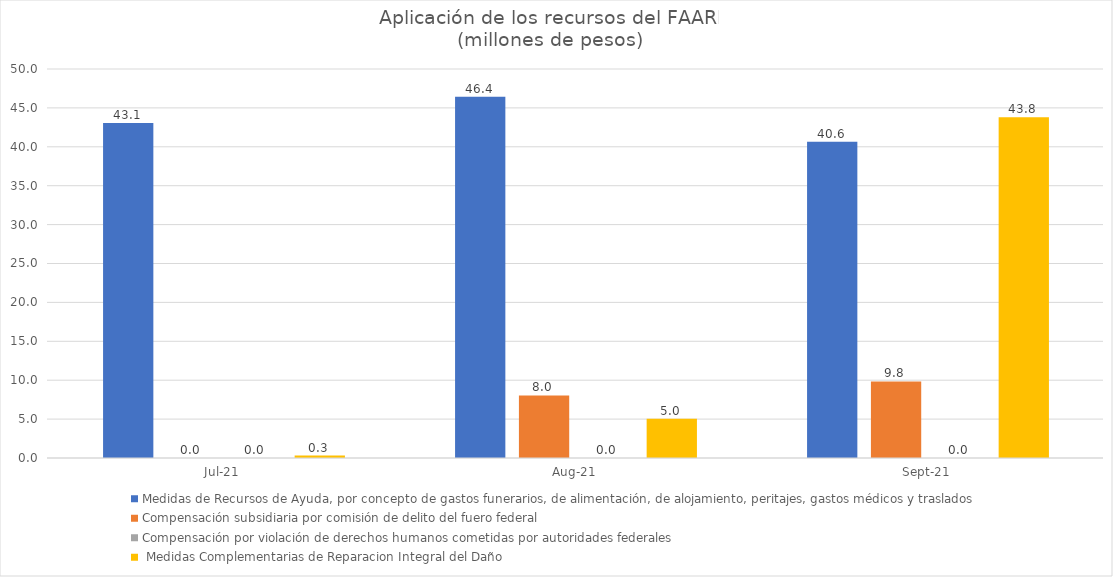
| Category | Medidas de Recursos de Ayuda, por concepto de gastos funerarios, de alimentación, de alojamiento, peritajes, gastos médicos y traslados | Compensación subsidiaria por comisión de delito del fuero federal | Compensación por violación de derechos humanos cometidas por autoridades federales |  Medidas Complementarias de Reparacion Integral del Daño |
|---|---|---|---|---|
| 2021-07-01 | 43.061 | 0 | 0 | 0.318 |
| 2021-08-01 | 46.442 | 8.037 | 0 | 5.045 |
| 2021-09-01 | 40.64 | 9.839 | 0 | 43.787 |